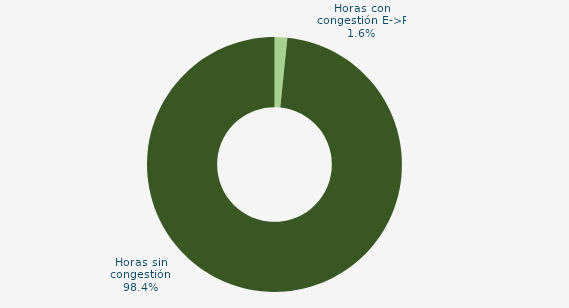
| Category | Horas con congestión E->P |
|---|---|
| Horas con congestión E->P | 1.613 |
| Horas con congestión P->E | 0 |
| Horas sin congestión | 98.387 |